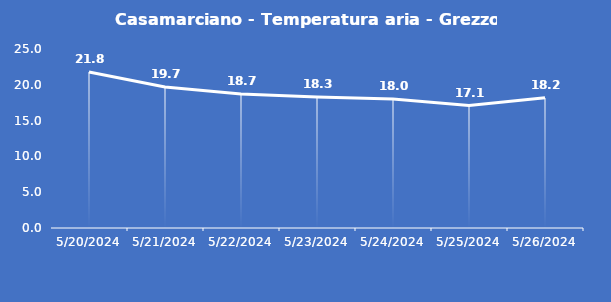
| Category | Casamarciano - Temperatura aria - Grezzo (°C) |
|---|---|
| 5/20/24 | 21.8 |
| 5/21/24 | 19.7 |
| 5/22/24 | 18.7 |
| 5/23/24 | 18.3 |
| 5/24/24 | 18 |
| 5/25/24 | 17.1 |
| 5/26/24 | 18.2 |